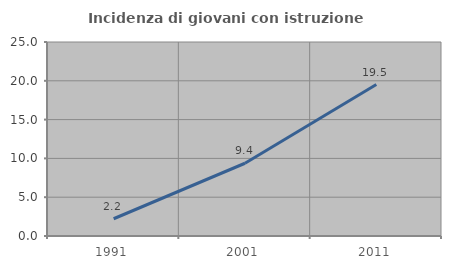
| Category | Incidenza di giovani con istruzione universitaria |
|---|---|
| 1991.0 | 2.222 |
| 2001.0 | 9.375 |
| 2011.0 | 19.512 |